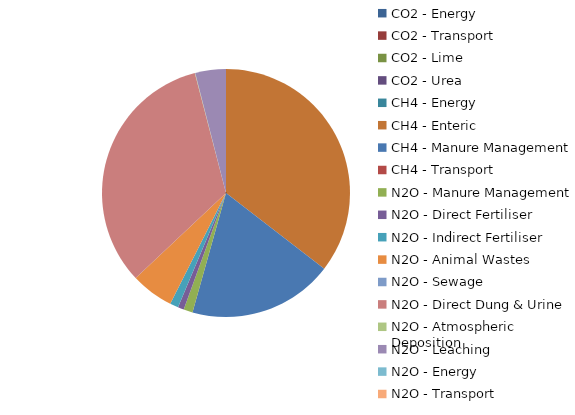
| Category | Series 0 |
|---|---|
| CO2 - Energy | 0 |
| CO2 - Transport | 0 |
| CO2 - Lime | 0 |
| CO2 - Urea | 0 |
| CH4 - Energy | 0 |
| CH4 - Enteric | 1530.558 |
| CH4 - Manure Management | 816.153 |
| CH4 - Transport | 0 |
| N2O - Manure Management | 50.864 |
| N2O - Direct Fertiliser | 34.106 |
| N2O - Indirect Fertiliser | 47.258 |
| N2O - Animal Wastes | 240.374 |
| N2O - Sewage  | 0 |
| N2O - Direct Dung & Urine | 1422.773 |
| N2O - Atmospheric Deposition | 2.421 |
| N2O - Leaching | 172.484 |
| N2O - Energy | 0 |
| N2O - Transport | 0 |